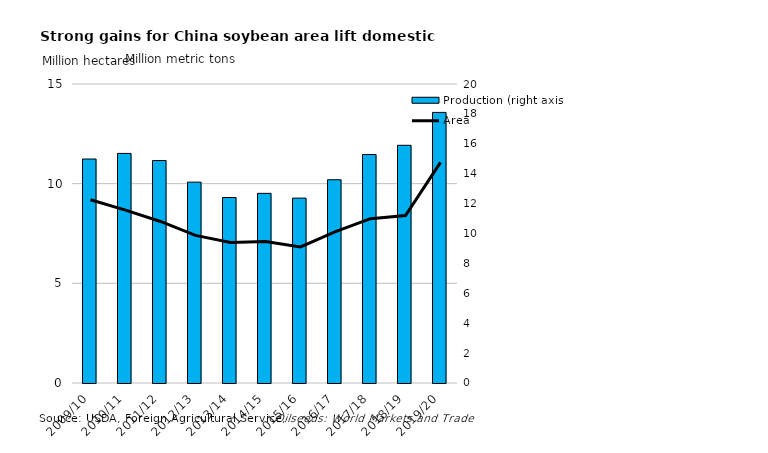
| Category | Production (right axis) |
|---|---|
| 2009/10 | 14.982 |
| 2010/11 | 15.357 |
| 2011/12 | 14.879 |
| 2012/13 | 13.436 |
| 2013/14 | 12.407 |
| 2014/15 | 12.686 |
| 2015/16 | 12.367 |
| 2016/17 | 13.596 |
| 2017/18 | 15.283 |
| 2018/19 | 15.9 |
| 2019/20 | 18.1 |